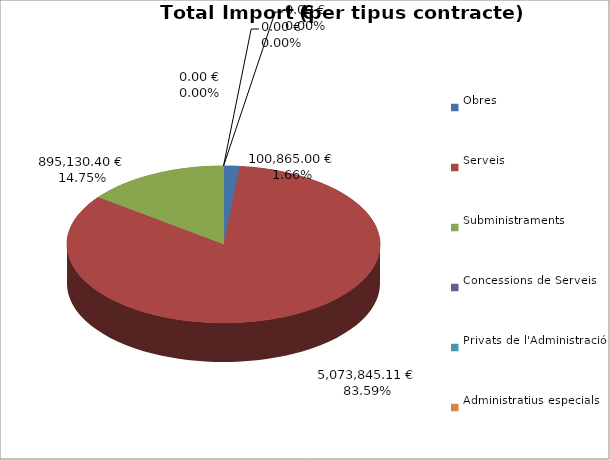
| Category | Total preu
(amb IVA) |
|---|---|
| Obres | 100864.995 |
| Serveis | 5073845.108 |
| Subministraments | 895130.4 |
| Concessions de Serveis | 0 |
| Privats de l'Administració | 0 |
| Administratius especials | 0 |